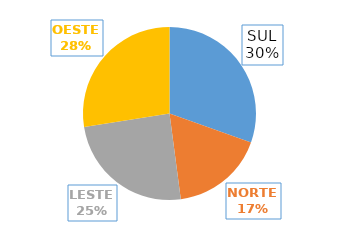
| Category | 3º TRI |
|---|---|
| SUL | 1559 |
| NORTE | 895 |
| LESTE | 1260 |
| OESTE | 1408 |